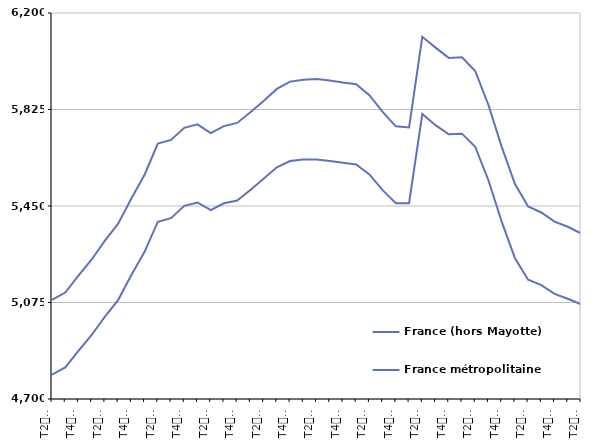
| Category | France (hors Mayotte) | France métropolitaine |
|---|---|---|
| T2
2013 | 5085.4 | 4794.6 |
| T3
2013 | 5113.8 | 4822.8 |
| T4
2013 | 5179.6 | 4886.7 |
| T1
2014 | 5242.1 | 4948.8 |
| T2
2014 | 5315.4 | 5020.2 |
| T3
2014 | 5381.3 | 5084.4 |
| T4
2014 | 5479.3 | 5181.5 |
| T1
2015 | 5571.4 | 5271.8 |
| T2
2015 | 5692.5 | 5388.9 |
| T3
2015 | 5706.9 | 5402.8 |
| T4
2015 | 5753.9 | 5450.5 |
| T1
2016 | 5767.1 | 5463.7 |
| T2
2016 | 5733.1 | 5434 |
| T3
2016 | 5760.5 | 5460.6 |
| T4
2016 | 5772.8 | 5471.4 |
| T1
2017 | 5814.6 | 5512.3 |
| T2
2017 | 5858 | 5555.6 |
| T3
2017 | 5905 | 5600.3 |
| T4
2017 | 5933.3 | 5624.8 |
| T1
2018 | 5941 | 5630.6 |
| T2
2018 | 5943.1 | 5630.6 |
| T3
2018 | 5937.4 | 5625 |
| T4
2018 | 5929.6 | 5617.8 |
| T1
2019 | 5923.2 | 5611.3 |
| T2
2019 | 5880.4 | 5572.5 |
| T3
2019 | 5815.6 | 5511.7 |
| T4
2019 | 5759.5 | 5461 |
| T1
2020 | 5755.4 | 5460.8 |
| T2
2020 | 6107.6 | 5807.5 |
| T3
2020 | 6065.4 | 5764.1 |
| T4
2020 | 6025.6 | 5728.8 |
| T1
2021 | 6027.6 | 5731.1 |
| T2
2021 | 5974.6 | 5679.8 |
| T3
2021 | 5842.6 | 5550.2 |
| T4
2021 | 5680.8 | 5389.5 |
| T1
2022 | 5536 | 5248.1 |
| T2
2022 | 5448 | 5163.7 |
| T3
2022 | 5424.8 | 5142.3 |
| T4
2022 | 5389.5 | 5108.6 |
| T1
2023 | 5369.3 | 5089.6 |
| T2
2023 | 5343.2 | 5067.7 |